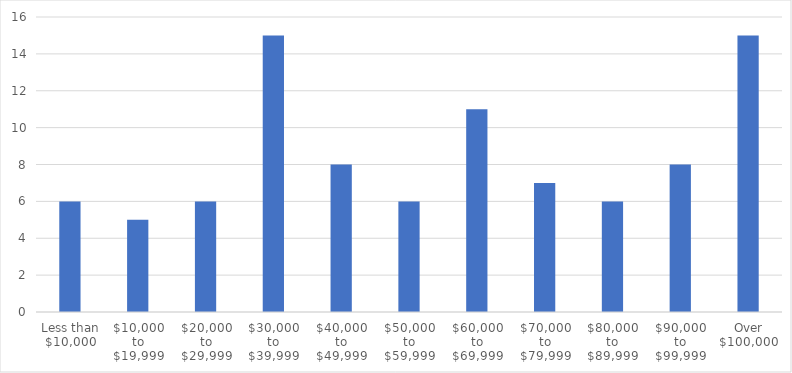
| Category | Number of Responses |
|---|---|
| Less than $10,000 | 6 |
| $10,000 to $19,999 | 5 |
| $20,000 to $29,999 | 6 |
| $30,000 to $39,999 | 15 |
| $40,000 to $49,999 | 8 |
| $50,000 to $59,999 | 6 |
| $60,000 to $69,999 | 11 |
| $70,000 to $79,999 | 7 |
| $80,000 to $89,999 | 6 |
| $90,000 to $99,999 | 8 |
| Over $100,000 | 15 |